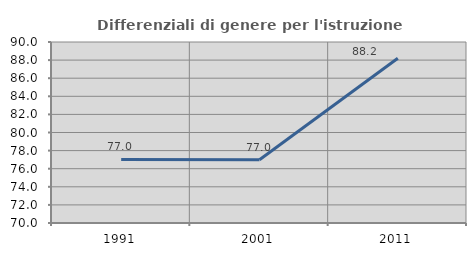
| Category | Differenziali di genere per l'istruzione superiore |
|---|---|
| 1991.0 | 77.027 |
| 2001.0 | 76.981 |
| 2011.0 | 88.213 |